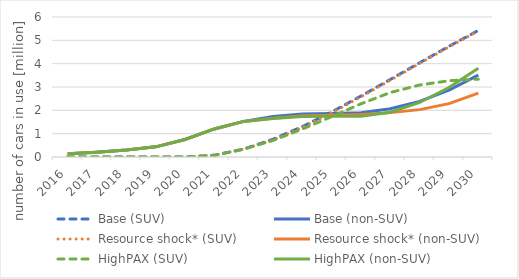
| Category | Base (SUV) | Base (non-SUV) | Resource shock* (SUV) | Resource shock* (non-SUV) | HighPAX (SUV) | HighPAX (non-SUV) |
|---|---|---|---|---|---|---|
| 2016.0 | 0 | 143120 | 0 | 143120 | 0 | 143120 |
| 2017.0 | 0 | 207829 | 0 | 207829 | 0 | 207829 |
| 2018.0 | 0 | 298717 | 0 | 298717 | 0 | 298717 |
| 2019.0 | 0 | 435072 | 0 | 435072 | 0 | 435072 |
| 2020.0 | 0 | 752609 | 0 | 752609 | 0 | 752609 |
| 2021.0 | 74553.4 | 1201700 | 74553.4 | 1201700 | 74553.4 | 1201700 |
| 2022.0 | 337555 | 1526390 | 337555 | 1526390 | 337555 | 1526390 |
| 2023.0 | 761498 | 1735780 | 723192 | 1659090 | 709538 | 1651480 |
| 2024.0 | 1303370 | 1841520 | 1265490 | 1765700 | 1197820 | 1739500 |
| 2025.0 | 1930390 | 1866870 | 1893760 | 1793530 | 1730250 | 1746980 |
| 2026.0 | 2612530 | 1898620 | 2577940 | 1824320 | 2280270 | 1751680 |
| 2027.0 | 3323230 | 2064870 | 3291300 | 1901750 | 2764280 | 1918490 |
| 2028.0 | 4039940 | 2382670 | 4011060 | 2030020 | 3085740 | 2336640 |
| 2029.0 | 4744340 | 2862950 | 4718670 | 2285880 | 3268590 | 2975750 |
| 2030.0 | 5422240 | 3510200 | 5399780 | 2738740 | 3335000 | 3807040 |